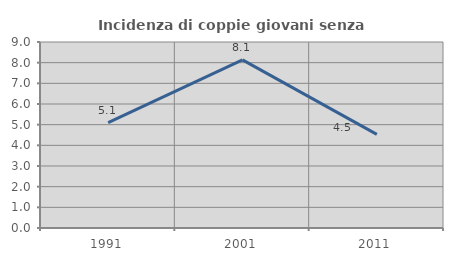
| Category | Incidenza di coppie giovani senza figli |
|---|---|
| 1991.0 | 5.096 |
| 2001.0 | 8.133 |
| 2011.0 | 4.533 |